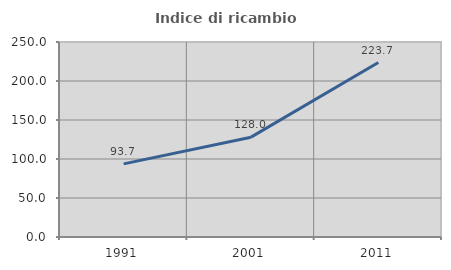
| Category | Indice di ricambio occupazionale  |
|---|---|
| 1991.0 | 93.721 |
| 2001.0 | 128 |
| 2011.0 | 223.684 |